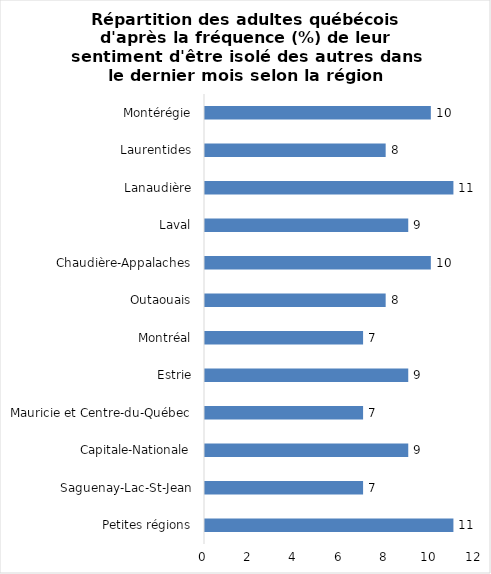
| Category | Series 0 |
|---|---|
| Petites régions | 11 |
| Saguenay-Lac-St-Jean | 7 |
| Capitale-Nationale | 9 |
| Mauricie et Centre-du-Québec | 7 |
| Estrie | 9 |
| Montréal | 7 |
| Outaouais | 8 |
| Chaudière-Appalaches | 10 |
| Laval | 9 |
| Lanaudière | 11 |
| Laurentides | 8 |
| Montérégie | 10 |